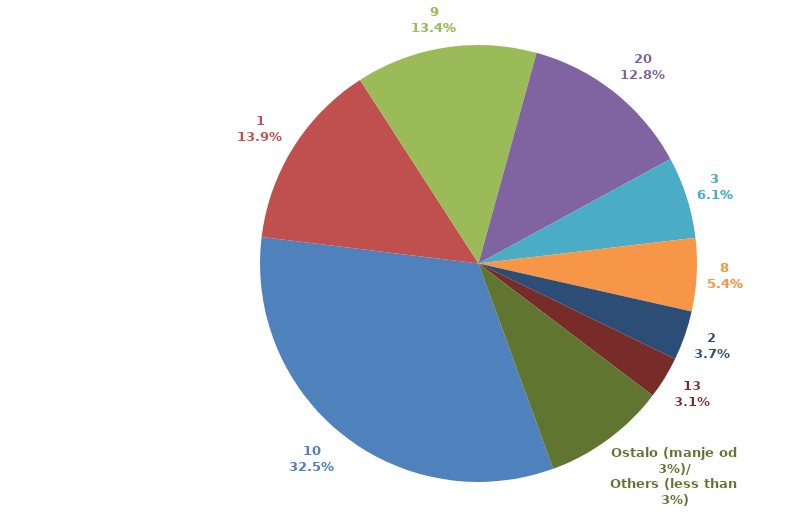
| Category | Series 0 | Series 1 |
|---|---|---|
| 10 | 4568131.487 | 0.325 |
| 1 | 1959343.053 | 0.139 |
| 9 | 1884340.964 | 0.134 |
| 20 | 1796593.16 | 0.128 |
| 3 | 851032.409 | 0.061 |
| 8 | 759612.249 | 0.054 |
| 2 | 515118.58 | 0.037 |
| 13 | 440933.805 | 0.031 |
| Ostalo (manje od 3%)/
Others (less than 3%) | 1281778.443 | 0.091 |